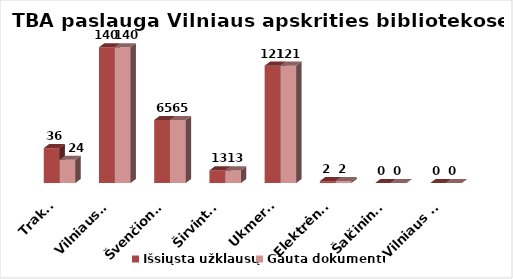
| Category | Išsiųsta užklausų | Gauta dokumentų |
|---|---|---|
| Trakai | 36 | 24 |
| Vilniaus r. | 140 | 140 |
| Švenčionys | 65 | 65 |
| Širvintos | 13 | 13 |
| Ukmergė | 121 | 121 |
| Elektrėnai | 2 | 2 |
| Šalčininkai | 0 | 0 |
| Vilniaus m. | 0 | 0 |